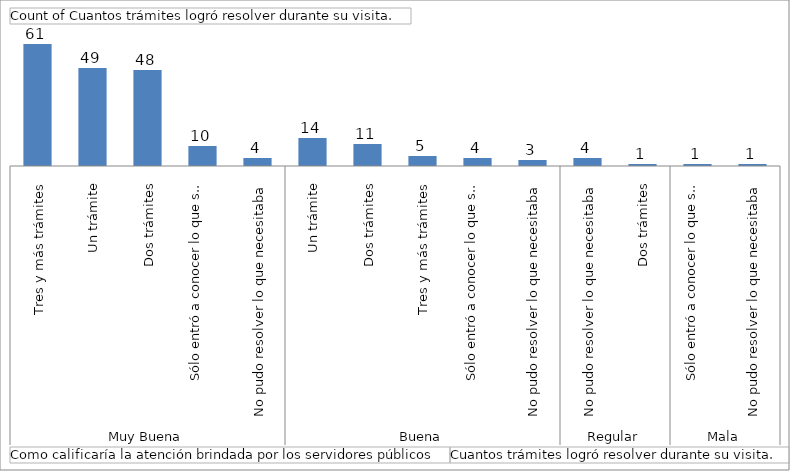
| Category | Total |
|---|---|
| 0 | 61 |
| 1 | 49 |
| 2 | 48 |
| 3 | 10 |
| 4 | 4 |
| 5 | 14 |
| 6 | 11 |
| 7 | 5 |
| 8 | 4 |
| 9 | 3 |
| 10 | 4 |
| 11 | 1 |
| 12 | 1 |
| 13 | 1 |